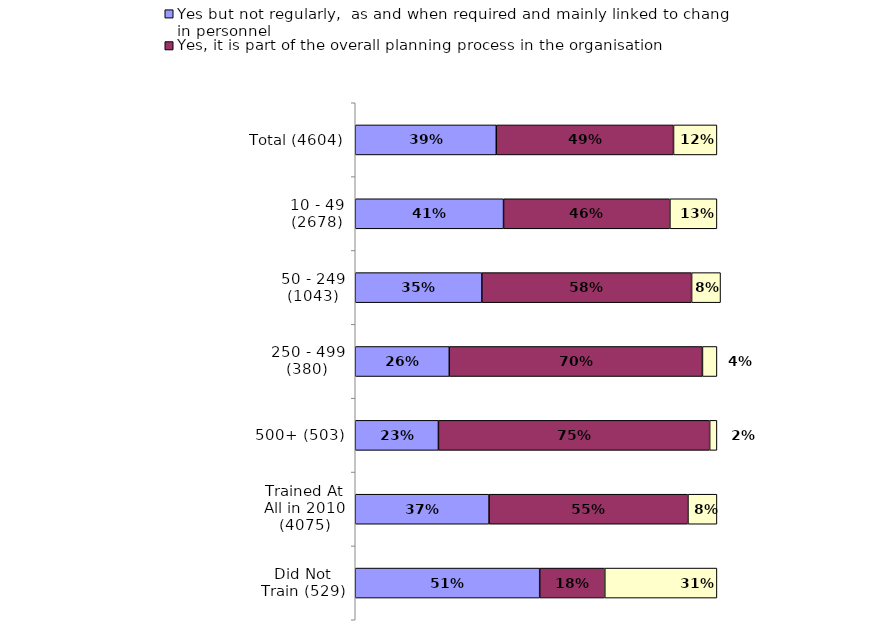
| Category | Yes but not regularly,  as and when required and mainly linked to changes in personnel | Yes, it is part of the overall planning process in the organisation | No |
|---|---|---|---|
| Total (4604) | 0.39 | 0.49 | 0.12 |
| 10 - 49 (2678) | 0.41 | 0.46 | 0.13 |
| 50 - 249 (1043) | 0.35 | 0.58 | 0.08 |
| 250 - 499 (380) | 0.26 | 0.7 | 0.04 |
| 500+ (503) | 0.23 | 0.75 | 0.02 |
| Trained At All in 2010 (4075) | 0.37 | 0.55 | 0.08 |
| Did Not Train (529) | 0.51 | 0.18 | 0.31 |